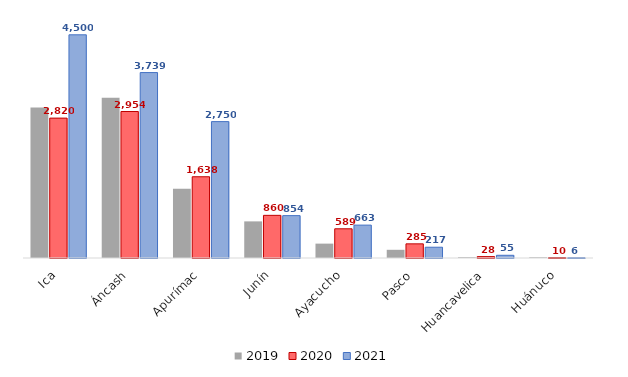
| Category | 2019 | 2020 | 2021 |
|---|---|---|---|
| Ica | 3032.96 | 2820.2 | 4499.83 |
| Áncash | 3228.56 | 2953.52 | 3738.53 |
| Apurímac | 1395.55 | 1637.8 | 2749.52 |
| Junín | 738.31 | 859.96 | 854.22 |
| Ayacucho | 289.9 | 589.08 | 663 |
| Pasco | 165.3 | 285.11 | 217.17 |
| Huancavelica | 15.72 | 27.74 | 54.76 |
| Huánuco | 13.66 | 9.61 | 6.23 |